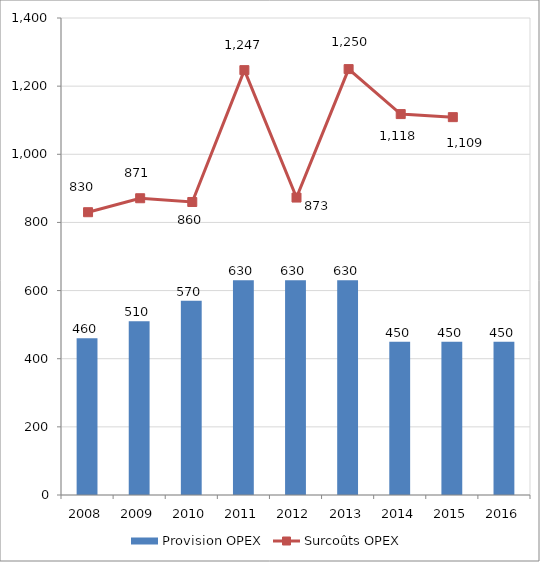
| Category | Provision OPEX |
|---|---|
| 2008.0 | 460 |
| 2009.0 | 510 |
| 2010.0 | 570 |
| 2011.0 | 630 |
| 2012.0 | 630 |
| 2013.0 | 630 |
| 2014.0 | 450 |
| 2015.0 | 450 |
| 2016.0 | 450 |